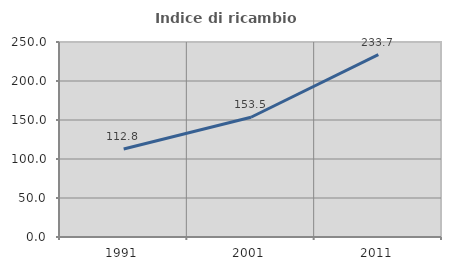
| Category | Indice di ricambio occupazionale  |
|---|---|
| 1991.0 | 112.827 |
| 2001.0 | 153.529 |
| 2011.0 | 233.748 |